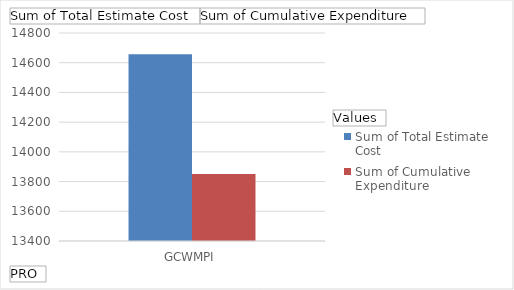
| Category | Sum of Total Estimate Cost | Sum of Cumulative Expenditure  |
|---|---|---|
| GCWMPI | 14657 | 13851.8 |